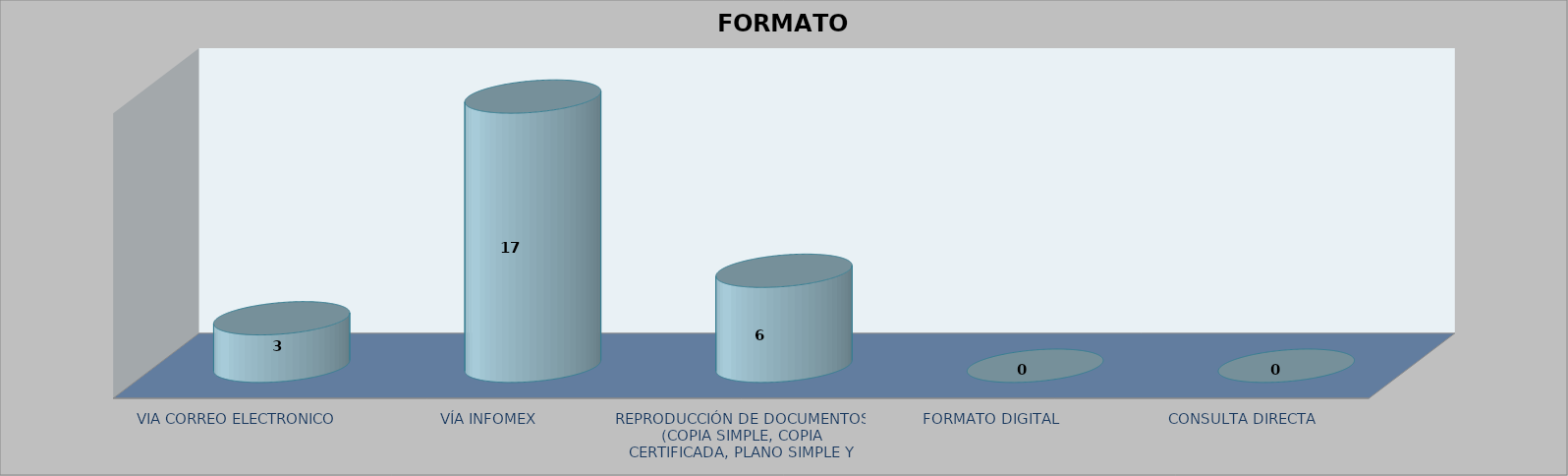
| Category |        FORMATO SOLICITADO | Series 1 | Series 2 |
|---|---|---|---|
| VIA CORREO ELECTRONICO |  |  | 3 |
| VÍA INFOMEX |  |  | 17 |
| REPRODUCCIÓN DE DOCUMENTOS (COPIA SIMPLE, COPIA CERTIFICADA, PLANO SIMPLE Y PLANO CERTIFICADO) |  |  | 6 |
| FORMATO DIGITAL |  |  | 0 |
| CONSULTA DIRECTA |  |  | 0 |